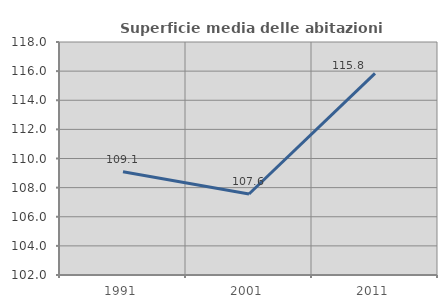
| Category | Superficie media delle abitazioni occupate |
|---|---|
| 1991.0 | 109.096 |
| 2001.0 | 107.563 |
| 2011.0 | 115.849 |